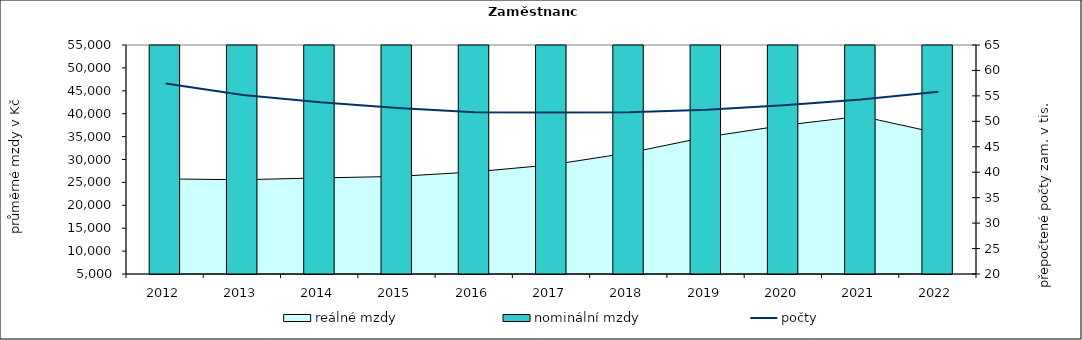
| Category | nominální mzdy  |
|---|---|
| 2012.0 | 25220.051 |
| 2013.0 | 25406.197 |
| 2014.0 | 25901.515 |
| 2015.0 | 26302.462 |
| 2016.0 | 27490.245 |
| 2017.0 | 29745.208 |
| 2018.0 | 33128.742 |
| 2019.0 | 37811.598 |
| 2020.0 | 41876.22 |
| 2021.0 | 45404.357 |
| 2022.0 | 46532.451 |